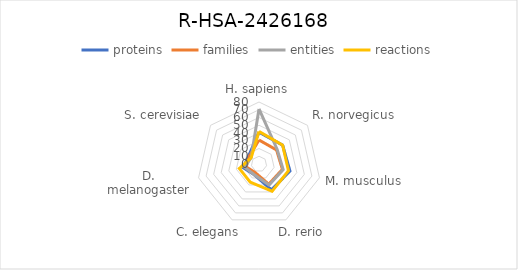
| Category | proteins | families | entities | reactions |
|---|---|---|---|---|
| H. sapiens | 41 | 31 | 71 | 42 |
| R. norvegicus | 39 | 29 | 30 | 39 |
| M. musculus | 41 | 31 | 32 | 39 |
| D. rerio | 37 | 29 | 30 | 39 |
| C. elegans | 15 | 12 | 15 | 26 |
| D. melanogaster | 21 | 17 | 19 | 26 |
| S. cerevisiae | 17 | 16 | 13 | 13 |